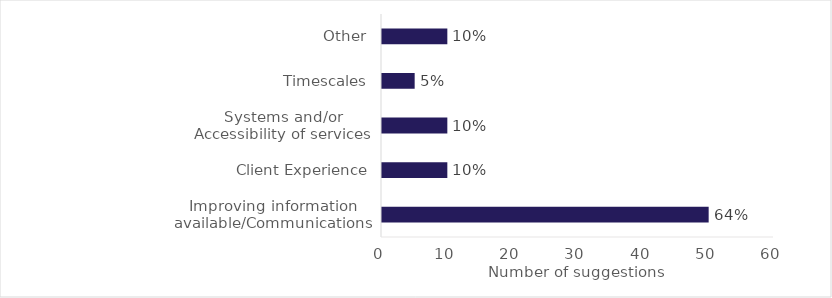
| Category | Series 0 |
|---|---|
| Improving information available/Communications | 50 |
| Client Experience | 10 |
| Systems and/or Accessibility of services | 10 |
| Timescales | 5 |
| Other | 10 |